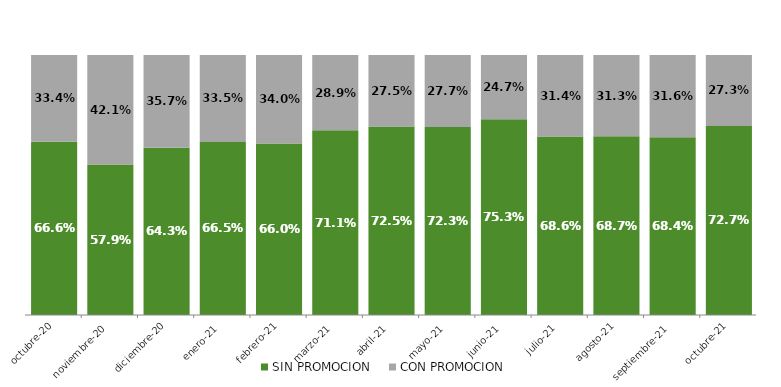
| Category | SIN PROMOCION   | CON PROMOCION   |
|---|---|---|
| 2020-10-01 | 0.666 | 0.334 |
| 2020-11-01 | 0.579 | 0.421 |
| 2020-12-01 | 0.643 | 0.357 |
| 2021-01-01 | 0.665 | 0.335 |
| 2021-02-01 | 0.66 | 0.34 |
| 2021-03-01 | 0.711 | 0.289 |
| 2021-04-01 | 0.725 | 0.275 |
| 2021-05-01 | 0.723 | 0.277 |
| 2021-06-01 | 0.753 | 0.247 |
| 2021-07-01 | 0.686 | 0.314 |
| 2021-08-01 | 0.687 | 0.313 |
| 2021-09-01 | 0.684 | 0.316 |
| 2021-10-01 | 0.727 | 0.273 |